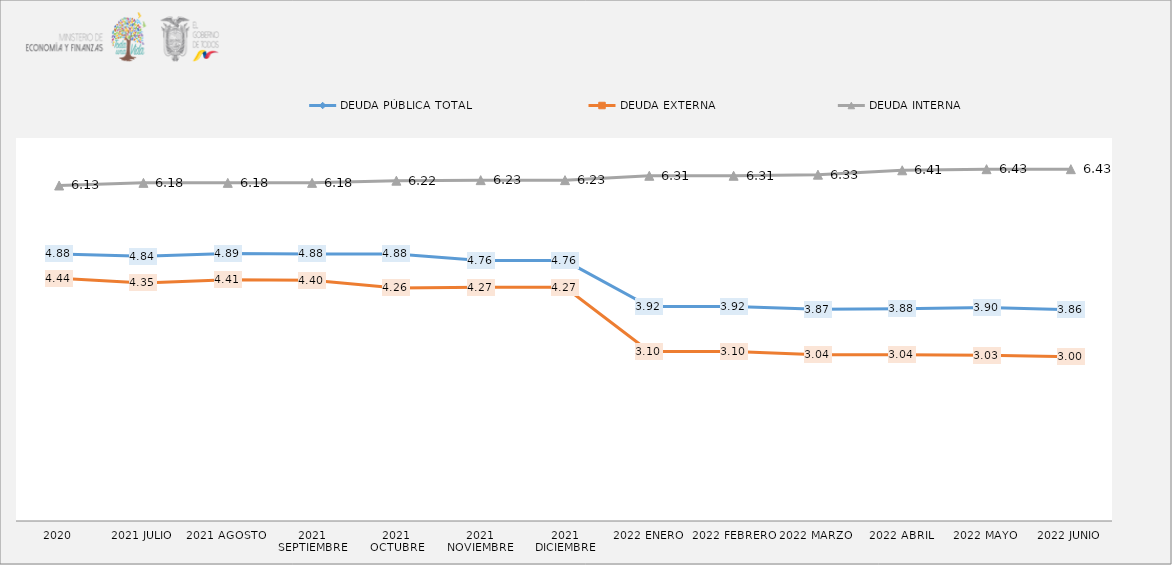
| Category | DEUDA PÚBLICA TOTAL | DEUDA EXTERNA  | DEUDA INTERNA |
|---|---|---|---|
| 2020 | 4.881 | 4.437 | 6.132 |
| 2021 JULIO | 4.84 | 4.351 | 6.18 |
| 2021 AGOSTO | 4.89 | 4.41 | 6.18 |
| 2021 SEPTIEMBRE | 4.88 | 4.4 | 6.18 |
| 2021 OCTUBRE | 4.88 | 4.26 | 6.22 |
| 2021 NOVIEMBRE | 4.76 | 4.27 | 6.23 |
| 2021 DICIEMBRE | 4.76 | 4.27 | 6.23 |
| 2022 ENERO | 3.92 | 3.1 | 6.31 |
| 2022 FEBRERO | 3.92 | 3.1 | 6.31 |
| 2022 MARZO | 3.87 | 3.04 | 6.33 |
| 2022 ABRIL | 3.88 | 3.04 | 6.41 |
| 2022 MAYO | 3.9 | 3.03 | 6.43 |
| 2022 JUNIO | 3.86 | 3 | 6.43 |